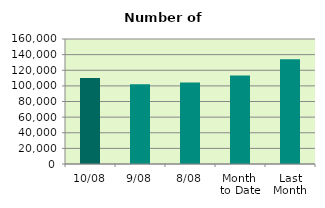
| Category | Series 0 |
|---|---|
| 10/08 | 110036 |
| 9/08 | 101932 |
| 8/08 | 104286 |
| Month 
to Date | 113337.25 |
| Last
Month | 134197.333 |